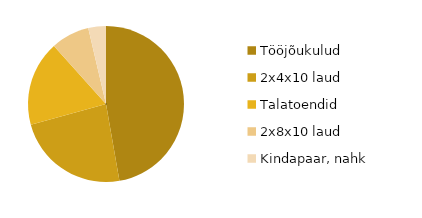
| Category | Series 0 |
|---|---|
| Tööjõukulud | 200 |
| 2x4x10 laud | 99.4 |
| Talatoendid | 74.7 |
| 2x8x10 laud | 33.75 |
| Kindapaar, nahk | 15.5 |